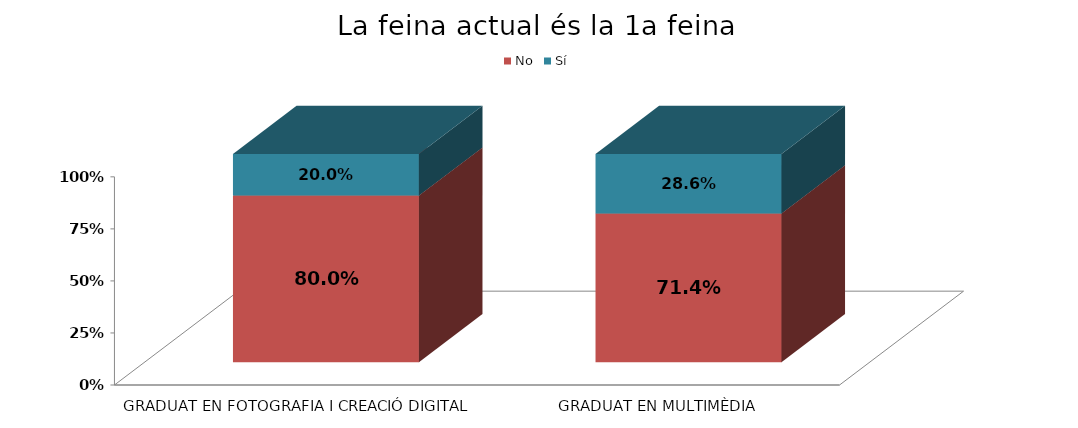
| Category | No | Sí |
|---|---|---|
| GRADUAT EN FOTOGRAFIA I CREACIÓ DIGITAL | 0.8 | 0.2 |
| GRADUAT EN MULTIMÈDIA | 0.714 | 0.286 |